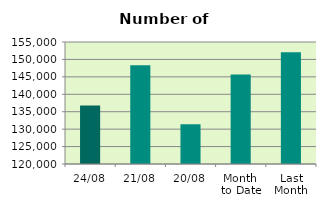
| Category | Series 0 |
|---|---|
| 24/08 | 136810 |
| 21/08 | 148362 |
| 20/08 | 131400 |
| Month 
to Date | 145668.25 |
| Last
Month | 152026.87 |